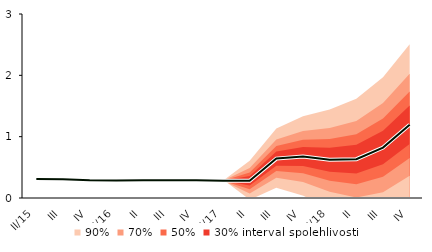
| Category | linka | Centerline |
|---|---|---|
| II/15 | 0.31 | 0.31 |
| III | 0.306 | 0.306 |
| IV | 0.29 | 0.29 |
| I/16 | 0.286 | 0.286 |
| II | 0.29 | 0.29 |
| III | 0.29 | 0.29 |
| IV | 0.289 | 0.289 |
| I/17 | 0.28 | 0.28 |
| II | 0.28 | 0.28 |
| III | 0.643 | 0.643 |
| IV | 0.677 | 0.677 |
| I/18 | 0.623 | 0.623 |
| II | 0.633 | 0.633 |
| III | 0.822 | 0.822 |
| IV | 1.194 | 1.194 |